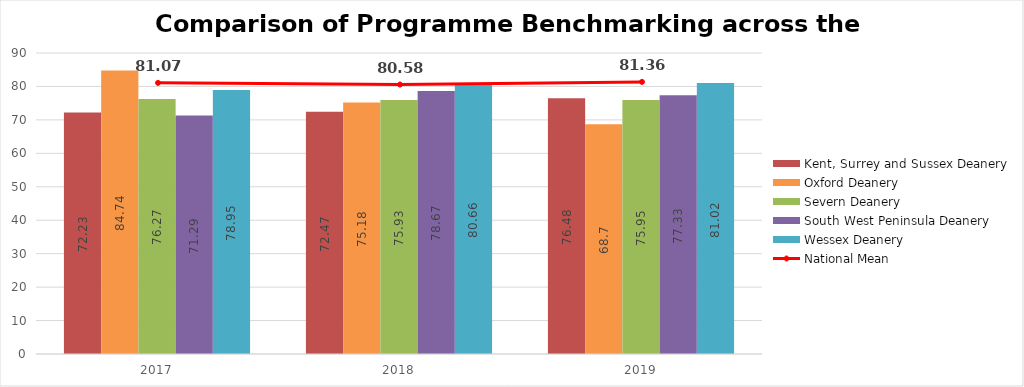
| Category | Kent, Surrey and Sussex Deanery | Oxford Deanery | Severn Deanery | South West Peninsula Deanery | Wessex Deanery |
|---|---|---|---|---|---|
| 2017 | 72.23 | 84.74 | 76.27 | 71.29 | 78.95 |
| 2018 | 72.47 | 75.18 | 75.93 | 78.67 | 80.66 |
| 2019 | 76.48 | 68.7 | 75.95 | 77.33 | 81.02 |